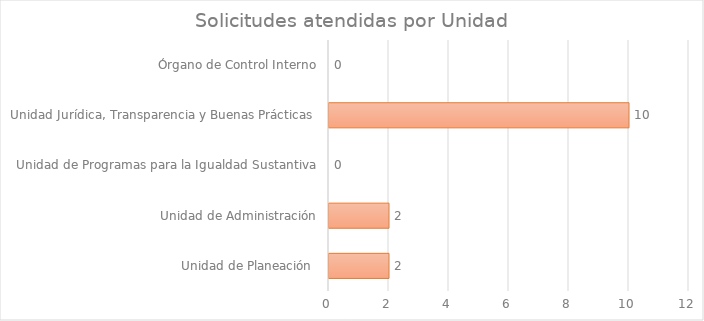
| Category | Series 1 |
|---|---|
| Unidad de Planeación  | 2 |
| Unidad de Administración | 2 |
| Unidad de Programas para la Igualdad Sustantiva | 0 |
| Unidad Jurídica, Transparencia y Buenas Prácticas  | 10 |
| Órgano de Control Interno | 0 |